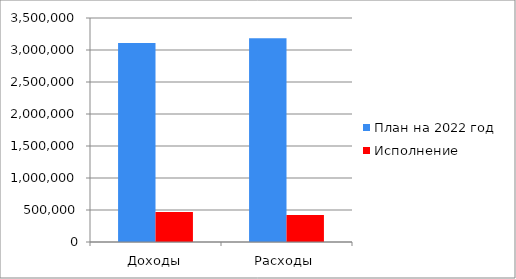
| Category | План на 2022 год | Исполнение |
|---|---|---|
| Доходы | 3110102.237 | 470432.41 |
| Расходы | 3184127.369 | 421362.948 |